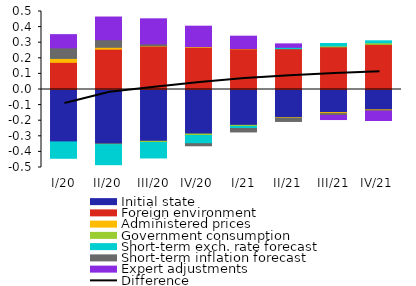
| Category | Initial state | Foreign environment | Administered prices | Government consumption | Short-term exch. rate forecast  | Short-term inflation forecast  | Expert adjustments |
|---|---|---|---|---|---|---|---|
| I/20 | -0.336 | 0.174 | 0.025 | 0 | -0.105 | 0.068 | 0.085 |
| II/20 | -0.35 | 0.258 | 0.012 | -0.003 | -0.128 | 0.049 | 0.145 |
| III/20 | -0.332 | 0.278 | 0.002 | -0.008 | -0.099 | 0.012 | 0.161 |
| IV/20 | -0.285 | 0.27 | 0.004 | -0.01 | -0.053 | -0.013 | 0.132 |
| I/21 | -0.23 | 0.261 | 0.002 | -0.007 | -0.013 | -0.022 | 0.079 |
| II/21 | -0.181 | 0.262 | -0.003 | 0 | 0.009 | -0.02 | 0.022 |
| III/21 | -0.148 | 0.273 | -0.006 | 0.006 | 0.016 | -0.012 | -0.026 |
| IV/21 | -0.131 | 0.289 | -0.005 | 0.01 | 0.013 | -0.003 | -0.06 |